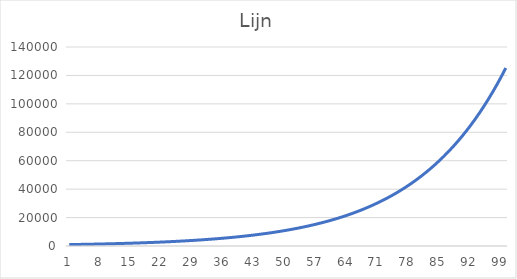
| Category | Series 0 |
|---|---|
| 0 | 1000 |
| 1 | 1050 |
| 2 | 1102.5 |
| 3 | 1157.625 |
| 4 | 1215.506 |
| 5 | 1276.282 |
| 6 | 1340.096 |
| 7 | 1407.1 |
| 8 | 1477.455 |
| 9 | 1551.328 |
| 10 | 1628.895 |
| 11 | 1710.339 |
| 12 | 1795.856 |
| 13 | 1885.649 |
| 14 | 1979.932 |
| 15 | 2078.928 |
| 16 | 2182.875 |
| 17 | 2292.018 |
| 18 | 2406.619 |
| 19 | 2526.95 |
| 20 | 2653.298 |
| 21 | 2785.963 |
| 22 | 2925.261 |
| 23 | 3071.524 |
| 24 | 3225.1 |
| 25 | 3386.355 |
| 26 | 3555.673 |
| 27 | 3733.456 |
| 28 | 3920.129 |
| 29 | 4116.136 |
| 30 | 4321.942 |
| 31 | 4538.039 |
| 32 | 4764.941 |
| 33 | 5003.189 |
| 34 | 5253.348 |
| 35 | 5516.015 |
| 36 | 5791.816 |
| 37 | 6081.407 |
| 38 | 6385.477 |
| 39 | 6704.751 |
| 40 | 7039.989 |
| 41 | 7391.988 |
| 42 | 7761.588 |
| 43 | 8149.667 |
| 44 | 8557.15 |
| 45 | 8985.008 |
| 46 | 9434.258 |
| 47 | 9905.971 |
| 48 | 10401.27 |
| 49 | 10921.333 |
| 50 | 11467.4 |
| 51 | 12040.77 |
| 52 | 12642.808 |
| 53 | 13274.949 |
| 54 | 13938.696 |
| 55 | 14635.631 |
| 56 | 15367.412 |
| 57 | 16135.783 |
| 58 | 16942.572 |
| 59 | 17789.701 |
| 60 | 18679.186 |
| 61 | 19613.145 |
| 62 | 20593.802 |
| 63 | 21623.493 |
| 64 | 22704.667 |
| 65 | 23839.901 |
| 66 | 25031.896 |
| 67 | 26283.49 |
| 68 | 27597.665 |
| 69 | 28977.548 |
| 70 | 30426.426 |
| 71 | 31947.747 |
| 72 | 33545.134 |
| 73 | 35222.391 |
| 74 | 36983.51 |
| 75 | 38832.686 |
| 76 | 40774.32 |
| 77 | 42813.036 |
| 78 | 44953.688 |
| 79 | 47201.372 |
| 80 | 49561.441 |
| 81 | 52039.513 |
| 82 | 54641.489 |
| 83 | 57373.563 |
| 84 | 60242.241 |
| 85 | 63254.353 |
| 86 | 66417.071 |
| 87 | 69737.925 |
| 88 | 73224.821 |
| 89 | 76886.062 |
| 90 | 80730.365 |
| 91 | 84766.883 |
| 92 | 89005.227 |
| 93 | 93455.489 |
| 94 | 98128.263 |
| 95 | 103034.676 |
| 96 | 108186.41 |
| 97 | 113595.731 |
| 98 | 119275.517 |
| 99 | 125239.293 |